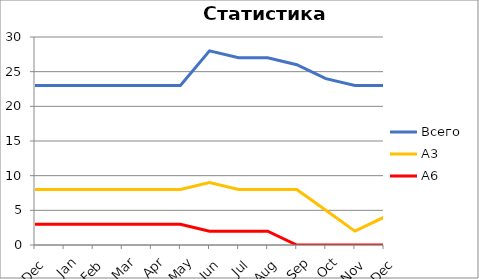
| Category | Всего | А3 | A6 |
|---|---|---|---|
| 0 | 23 | 8 | 3 |
| 1 | 23 | 8 | 3 |
| 2 | 23 | 8 | 3 |
| 3 | 23 | 8 | 3 |
| 4 | 23 | 8 | 3 |
| 5 | 23 | 8 | 3 |
| 6 | 28 | 9 | 2 |
| 7 | 27 | 8 | 2 |
| 8 | 27 | 8 | 2 |
| 9 | 26 | 8 | 0 |
| 10 | 24 | 5 | 0 |
| 11 | 23 | 2 | 0 |
| 12 | 23 | 4 | 0 |